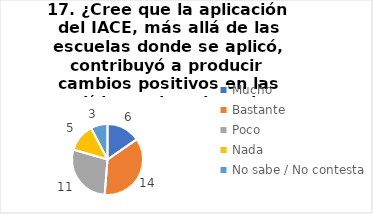
| Category | 17. ¿Cree que la aplicación del IACE, más allá de las escuelas donde se aplicó, contribuyó a producir cambios positivos en las políticas educativas de su provincia? |
|---|---|
| Mucho  | 0.154 |
| Bastante  | 0.359 |
| Poco  | 0.282 |
| Nada  | 0.128 |
| No sabe / No contesta | 0.077 |